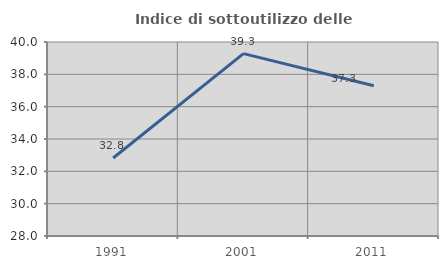
| Category | Indice di sottoutilizzo delle abitazioni  |
|---|---|
| 1991.0 | 32.825 |
| 2001.0 | 39.281 |
| 2011.0 | 37.295 |